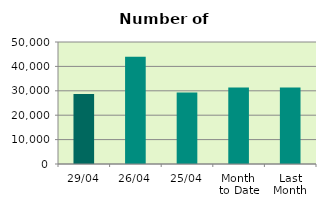
| Category | Series 0 |
|---|---|
| 29/04 | 28728 |
| 26/04 | 44000 |
| 25/04 | 29282 |
| Month 
to Date | 31365.789 |
| Last
Month | 31344.095 |